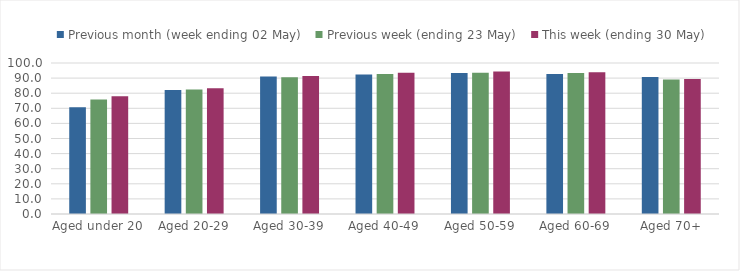
| Category | Previous month (week ending 02 May) | Previous week (ending 23 May) | This week (ending 30 May) |
|---|---|---|---|
| Aged under 20 | 70.753 | 75.862 | 78.021 |
| Aged 20-29 | 82.195 | 82.418 | 83.297 |
| Aged 30-39 | 91.014 | 90.585 | 91.329 |
| Aged 40-49 | 92.42 | 92.7 | 93.523 |
| Aged 50-59 | 93.455 | 93.573 | 94.29 |
| Aged 60-69 | 92.737 | 93.355 | 93.948 |
| Aged 70+ | 90.66 | 89.099 | 89.392 |